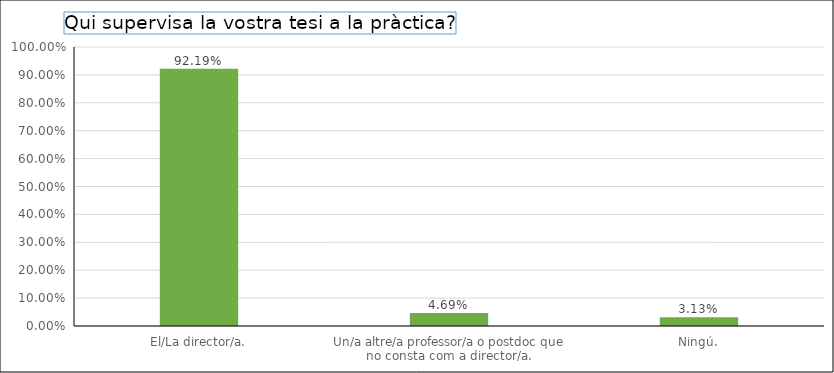
| Category | Series 0 |
|---|---|
| El/La director/a. | 0.922 |
| Un/a altre/a professor/a o postdoc que no consta com a director/a. | 0.047 |
| Ningú. | 0.031 |